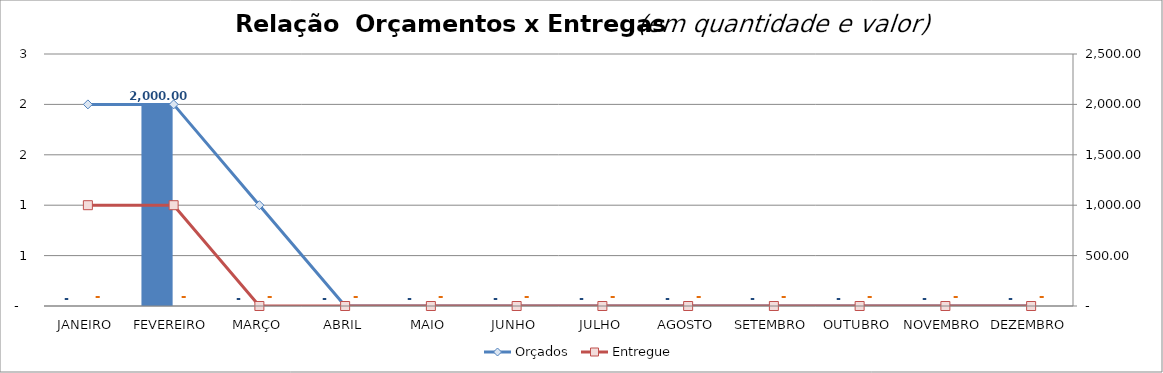
| Category | Series 2 | Series 3 |
|---|---|---|
| 0 | 0 | 0 |
| 1 | 2000 | 0 |
| 2 | 0 | 0 |
| 3 | 0 | 0 |
| 4 | 0 | 0 |
| 5 | 0 | 0 |
| 6 | 0 | 0 |
| 7 | 0 | 0 |
| 8 | 0 | 0 |
| 9 | 0 | 0 |
| 10 | 0 | 0 |
| 11 | 0 | 0 |